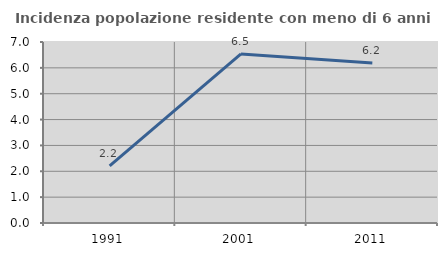
| Category | Incidenza popolazione residente con meno di 6 anni |
|---|---|
| 1991.0 | 2.206 |
| 2001.0 | 6.538 |
| 2011.0 | 6.192 |